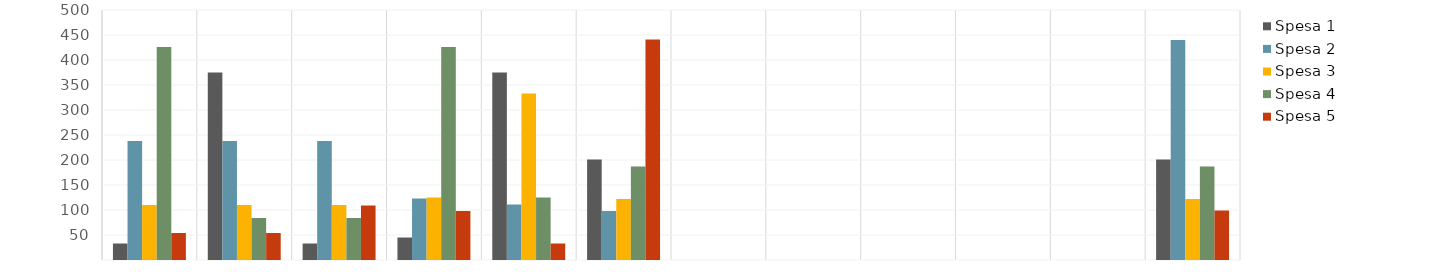
| Category | Spesa 1 | Spesa 2 | Spesa 3 | Spesa 4 | Spesa 5 |
|---|---|---|---|---|---|
| Gen | 33 | 238 | 110 | 426 | 54 |
| Feb | 375 | 238 | 110 | 84 | 54 |
| Mar | 33 | 238 | 110 | 84 | 109 |
| Apr | 45 | 123 | 125 | 426 | 98 |
| Mag | 375 | 111 | 333 | 125 | 33 |
| Giu | 201 | 98 | 122 | 187 | 441 |
| Lug | 0 | 0 | 0 | 0 | 0 |
| Ago | 0 | 0 | 0 | 0 | 0 |
| Set | 0 | 0 | 0 | 0 | 0 |
| Ott | 0 | 0 | 0 | 0 | 0 |
| Nov | 0 | 0 | 0 | 0 | 0 |
| Dic | 201 | 440 | 122 | 187 | 99 |